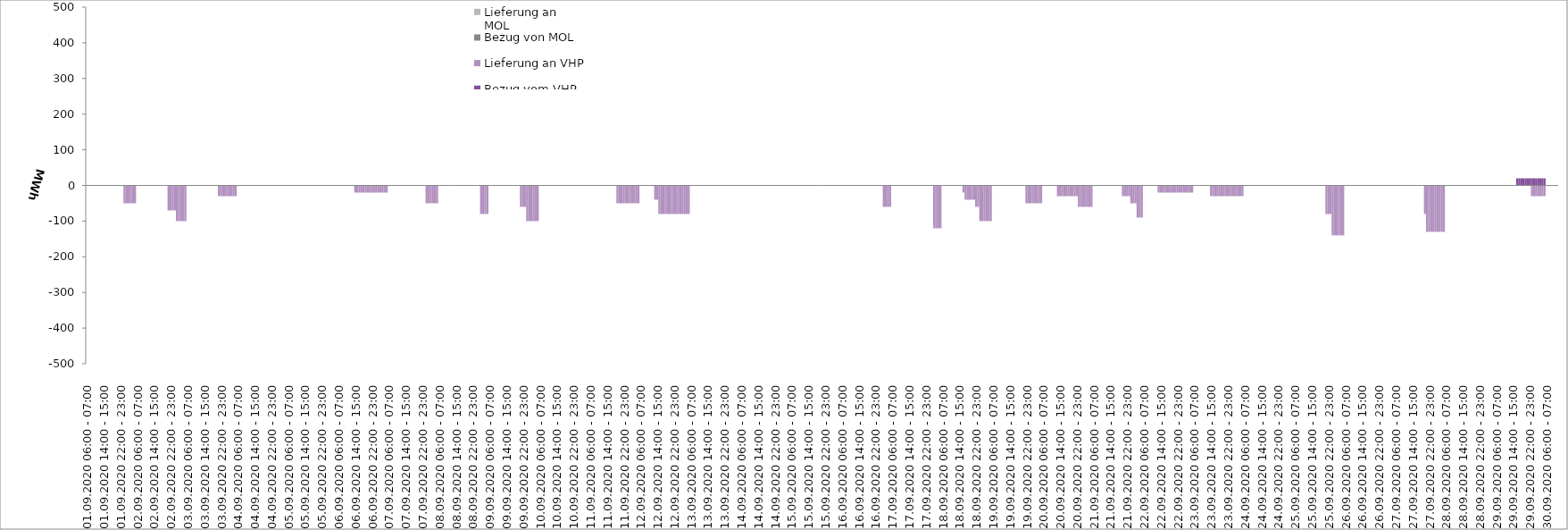
| Category | Bezug vom VHP | Lieferung an VHP | Bezug von MOL | Lieferung an MOL |
|---|---|---|---|---|
| 01.09.2020 06:00 - 07:00 | 0 | 0 | 0 | 0 |
| 01.09.2020 07:00 - 08:00 | 0 | 0 | 0 | 0 |
| 01.09.2020 08:00 - 09:00 | 0 | 0 | 0 | 0 |
| 01.09.2020 09:00 - 10:00 | 0 | 0 | 0 | 0 |
| 01.09.2020 10:00 - 11:00 | 0 | 0 | 0 | 0 |
| 01.09.2020 11:00 - 12:00 | 0 | 0 | 0 | 0 |
| 01.09.2020 12:00 - 13:00 | 0 | 0 | 0 | 0 |
| 01.09.2020 13:00 - 14:00 | 0 | 0 | 0 | 0 |
| 01.09.2020 14:00 - 15:00 | 0 | 0 | 0 | 0 |
| 01.09.2020 15:00 - 16:00 | 0 | 0 | 0 | 0 |
| 01.09.2020 16:00 - 17:00 | 0 | 0 | 0 | 0 |
| 01.09.2020 17:00 - 18:00 | 0 | 0 | 0 | 0 |
| 01.09.2020 18:00 - 19:00 | 0 | 0 | 0 | 0 |
| 01.09.2020 19:00 - 20:00 | 0 | 0 | 0 | 0 |
| 01.09.2020 20:00 - 21:00 | 0 | 0 | 0 | 0 |
| 01.09.2020 21:00 - 22:00 | 0 | 0 | 0 | 0 |
| 01.09.2020 22:00 - 23:00 | 0 | 0 | 0 | 0 |
| 01.09.2020 23:00 - 24:00 | 0 | 0 | 0 | 0 |
| 02.09.2020 00:00 - 01:00 | 0 | -50 | 0 | 0 |
| 02.09.2020 01:00 - 02:00 | 0 | -50 | 0 | 0 |
| 02.09.2020 02:00 - 03:00 | 0 | -50 | 0 | 0 |
| 02.09.2020 03:00 - 04:00 | 0 | -50 | 0 | 0 |
| 02.09.2020 04:00 - 05:00 | 0 | -50 | 0 | 0 |
| 02.09.2020 05:00 - 06:00 | 0 | -50 | 0 | 0 |
| 02.09.2020 06:00 - 07:00 | 0 | 0 | 0 | 0 |
| 02.09.2020 07:00 - 08:00 | 0 | 0 | 0 | 0 |
| 02.09.2020 08:00 - 09:00 | 0 | 0 | 0 | 0 |
| 02.09.2020 09:00 - 10:00 | 0 | 0 | 0 | 0 |
| 02.09.2020 10:00 - 11:00 | 0 | 0 | 0 | 0 |
| 02.09.2020 11:00 - 12:00 | 0 | 0 | 0 | 0 |
| 02.09.2020 12:00 - 13:00 | 0 | 0 | 0 | 0 |
| 02.09.2020 13:00 - 14:00 | 0 | 0 | 0 | 0 |
| 02.09.2020 14:00 - 15:00 | 0 | 0 | 0 | 0 |
| 02.09.2020 15:00 - 16:00 | 0 | 0 | 0 | 0 |
| 02.09.2020 16:00 - 17:00 | 0 | 0 | 0 | 0 |
| 02.09.2020 17:00 - 18:00 | 0 | 0 | 0 | 0 |
| 02.09.2020 18:00 - 19:00 | 0 | 0 | 0 | 0 |
| 02.09.2020 19:00 - 20:00 | 0 | 0 | 0 | 0 |
| 02.09.2020 20:00 - 21:00 | 0 | 0 | 0 | 0 |
| 02.09.2020 21:00 - 22:00 | 0 | -70 | 0 | 0 |
| 02.09.2020 22:00 - 23:00 | 0 | -70 | 0 | 0 |
| 02.09.2020 23:00 - 24:00 | 0 | -70 | 0 | 0 |
| 03.09.2020 00:00 - 01:00 | 0 | -70 | 0 | 0 |
| 03.09.2020 01:00 - 02:00 | 0 | -100 | 0 | 0 |
| 03.09.2020 02:00 - 03:00 | 0 | -100 | 0 | 0 |
| 03.09.2020 03:00 - 04:00 | 0 | -100 | 0 | 0 |
| 03.09.2020 04:00 - 05:00 | 0 | -100 | 0 | 0 |
| 03.09.2020 05:00 - 06:00 | 0 | -100 | 0 | 0 |
| 03.09.2020 06:00 - 07:00 | 0 | 0 | 0 | 0 |
| 03.09.2020 07:00 - 08:00 | 0 | 0 | 0 | 0 |
| 03.09.2020 08:00 - 09:00 | 0 | 0 | 0 | 0 |
| 03.09.2020 09:00 - 10:00 | 0 | 0 | 0 | 0 |
| 03.09.2020 10:00 - 11:00 | 0 | 0 | 0 | 0 |
| 03.09.2020 11:00 - 12:00 | 0 | 0 | 0 | 0 |
| 03.09.2020 12:00 - 13:00 | 0 | 0 | 0 | 0 |
| 03.09.2020 13:00 - 14:00 | 0 | 0 | 0 | 0 |
| 03.09.2020 14:00 - 15:00 | 0 | 0 | 0 | 0 |
| 03.09.2020 15:00 - 16:00 | 0 | 0 | 0 | 0 |
| 03.09.2020 16:00 - 17:00 | 0 | 0 | 0 | 0 |
| 03.09.2020 17:00 - 18:00 | 0 | 0 | 0 | 0 |
| 03.09.2020 18:00 - 19:00 | 0 | 0 | 0 | 0 |
| 03.09.2020 19:00 - 20:00 | 0 | 0 | 0 | 0 |
| 03.09.2020 20:00 - 21:00 | 0 | 0 | 0 | 0 |
| 03.09.2020 21:00 - 22:00 | 0 | -30 | 0 | 0 |
| 03.09.2020 22:00 - 23:00 | 0 | -30 | 0 | 0 |
| 03.09.2020 23:00 - 24:00 | 0 | -30 | 0 | 0 |
| 04.09.2020 00:00 - 01:00 | 0 | -30 | 0 | 0 |
| 04.09.2020 01:00 - 02:00 | 0 | -30 | 0 | 0 |
| 04.09.2020 02:00 - 03:00 | 0 | -30 | 0 | 0 |
| 04.09.2020 03:00 - 04:00 | 0 | -30 | 0 | 0 |
| 04.09.2020 04:00 - 05:00 | 0 | -30 | 0 | 0 |
| 04.09.2020 05:00 - 06:00 | 0 | -30 | 0 | 0 |
| 04.09.2020 06:00 - 07:00 | 0 | 0 | 0 | 0 |
| 04.09.2020 07:00 - 08:00 | 0 | 0 | 0 | 0 |
| 04.09.2020 08:00 - 09:00 | 0 | 0 | 0 | 0 |
| 04.09.2020 09:00 - 10:00 | 0 | 0 | 0 | 0 |
| 04.09.2020 10:00 - 11:00 | 0 | 0 | 0 | 0 |
| 04.09.2020 11:00 - 12:00 | 0 | 0 | 0 | 0 |
| 04.09.2020 12:00 - 13:00 | 0 | 0 | 0 | 0 |
| 04.09.2020 13:00 - 14:00 | 0 | 0 | 0 | 0 |
| 04.09.2020 14:00 - 15:00 | 0 | 0 | 0 | 0 |
| 04.09.2020 15:00 - 16:00 | 0 | 0 | 0 | 0 |
| 04.09.2020 16:00 - 17:00 | 0 | 0 | 0 | 0 |
| 04.09.2020 17:00 - 18:00 | 0 | 0 | 0 | 0 |
| 04.09.2020 18:00 - 19:00 | 0 | 0 | 0 | 0 |
| 04.09.2020 19:00 - 20:00 | 0 | 0 | 0 | 0 |
| 04.09.2020 20:00 - 21:00 | 0 | 0 | 0 | 0 |
| 04.09.2020 21:00 - 22:00 | 0 | 0 | 0 | 0 |
| 04.09.2020 22:00 - 23:00 | 0 | 0 | 0 | 0 |
| 04.09.2020 23:00 - 24:00 | 0 | 0 | 0 | 0 |
| 05.09.2020 00:00 - 01:00 | 0 | 0 | 0 | 0 |
| 05.09.2020 01:00 - 02:00 | 0 | 0 | 0 | 0 |
| 05.09.2020 02:00 - 03:00 | 0 | 0 | 0 | 0 |
| 05.09.2020 03:00 - 04:00 | 0 | 0 | 0 | 0 |
| 05.09.2020 04:00 - 05:00 | 0 | 0 | 0 | 0 |
| 05.09.2020 05:00 - 06:00 | 0 | 0 | 0 | 0 |
| 05.09.2020 06:00 - 07:00 | 0 | 0 | 0 | 0 |
| 05.09.2020 07:00 - 08:00 | 0 | 0 | 0 | 0 |
| 05.09.2020 08:00 - 09:00 | 0 | 0 | 0 | 0 |
| 05.09.2020 09:00 - 10:00 | 0 | 0 | 0 | 0 |
| 05.09.2020 10:00 - 11:00 | 0 | 0 | 0 | 0 |
| 05.09.2020 11:00 - 12:00 | 0 | 0 | 0 | 0 |
| 05.09.2020 12:00 - 13:00 | 0 | 0 | 0 | 0 |
| 05.09.2020 13:00 - 14:00 | 0 | 0 | 0 | 0 |
| 05.09.2020 14:00 - 15:00 | 0 | 0 | 0 | 0 |
| 05.09.2020 15:00 - 16:00 | 0 | 0 | 0 | 0 |
| 05.09.2020 16:00 - 17:00 | 0 | 0 | 0 | 0 |
| 05.09.2020 17:00 - 18:00 | 0 | 0 | 0 | 0 |
| 05.09.2020 18:00 - 19:00 | 0 | 0 | 0 | 0 |
| 05.09.2020 19:00 - 20:00 | 0 | 0 | 0 | 0 |
| 05.09.2020 20:00 - 21:00 | 0 | 0 | 0 | 0 |
| 05.09.2020 21:00 - 22:00 | 0 | 0 | 0 | 0 |
| 05.09.2020 22:00 - 23:00 | 0 | 0 | 0 | 0 |
| 05.09.2020 23:00 - 24:00 | 0 | 0 | 0 | 0 |
| 06.09.2020 00:00 - 01:00 | 0 | 0 | 0 | 0 |
| 06.09.2020 01:00 - 02:00 | 0 | 0 | 0 | 0 |
| 06.09.2020 02:00 - 03:00 | 0 | 0 | 0 | 0 |
| 06.09.2020 03:00 - 04:00 | 0 | 0 | 0 | 0 |
| 06.09.2020 04:00 - 05:00 | 0 | 0 | 0 | 0 |
| 06.09.2020 05:00 - 06:00 | 0 | 0 | 0 | 0 |
| 06.09.2020 06:00 - 07:00 | 0 | 0 | 0 | 0 |
| 06.09.2020 07:00 - 08:00 | 0 | 0 | 0 | 0 |
| 06.09.2020 08:00 - 09:00 | 0 | 0 | 0 | 0 |
| 06.09.2020 09:00 - 10:00 | 0 | 0 | 0 | 0 |
| 06.09.2020 10:00 - 11:00 | 0 | 0 | 0 | 0 |
| 06.09.2020 11:00 - 12:00 | 0 | 0 | 0 | 0 |
| 06.09.2020 12:00 - 13:00 | 0 | 0 | 0 | 0 |
| 06.09.2020 13:00 - 14:00 | 0 | 0 | 0 | 0 |
| 06.09.2020 14:00 - 15:00 | 0 | -20 | 0 | 0 |
| 06.09.2020 15:00 - 16:00 | 0 | -20 | 0 | 0 |
| 06.09.2020 16:00 - 17:00 | 0 | -20 | 0 | 0 |
| 06.09.2020 17:00 - 18:00 | 0 | -20 | 0 | 0 |
| 06.09.2020 18:00 - 19:00 | 0 | -20 | 0 | 0 |
| 06.09.2020 19:00 - 20:00 | 0 | -20 | 0 | 0 |
| 06.09.2020 20:00 - 21:00 | 0 | -20 | 0 | 0 |
| 06.09.2020 21:00 - 22:00 | 0 | -20 | 0 | 0 |
| 06.09.2020 22:00 - 23:00 | 0 | -20 | 0 | 0 |
| 06.09.2020 23:00 - 24:00 | 0 | -20 | 0 | 0 |
| 07.09.2020 00:00 - 01:00 | 0 | -20 | 0 | 0 |
| 07.09.2020 01:00 - 02:00 | 0 | -20 | 0 | 0 |
| 07.09.2020 02:00 - 03:00 | 0 | -20 | 0 | 0 |
| 07.09.2020 03:00 - 04:00 | 0 | -20 | 0 | 0 |
| 07.09.2020 04:00 - 05:00 | 0 | -20 | 0 | 0 |
| 07.09.2020 05:00 - 06:00 | 0 | -20 | 0 | 0 |
| 07.09.2020 06:00 - 07:00 | 0 | 0 | 0 | 0 |
| 07.09.2020 07:00 - 08:00 | 0 | 0 | 0 | 0 |
| 07.09.2020 08:00 - 09:00 | 0 | 0 | 0 | 0 |
| 07.09.2020 09:00 - 10:00 | 0 | 0 | 0 | 0 |
| 07.09.2020 10:00 - 11:00 | 0 | 0 | 0 | 0 |
| 07.09.2020 11:00 - 12:00 | 0 | 0 | 0 | 0 |
| 07.09.2020 12:00 - 13:00 | 0 | 0 | 0 | 0 |
| 07.09.2020 13:00 - 14:00 | 0 | 0 | 0 | 0 |
| 07.09.2020 14:00 - 15:00 | 0 | 0 | 0 | 0 |
| 07.09.2020 15:00 - 16:00 | 0 | 0 | 0 | 0 |
| 07.09.2020 16:00 - 17:00 | 0 | 0 | 0 | 0 |
| 07.09.2020 17:00 - 18:00 | 0 | 0 | 0 | 0 |
| 07.09.2020 18:00 - 19:00 | 0 | 0 | 0 | 0 |
| 07.09.2020 19:00 - 20:00 | 0 | 0 | 0 | 0 |
| 07.09.2020 20:00 - 21:00 | 0 | 0 | 0 | 0 |
| 07.09.2020 21:00 - 22:00 | 0 | 0 | 0 | 0 |
| 07.09.2020 22:00 - 23:00 | 0 | 0 | 0 | 0 |
| 07.09.2020 23:00 - 24:00 | 0 | 0 | 0 | 0 |
| 08.09.2020 00:00 - 01:00 | 0 | -50 | 0 | 0 |
| 08.09.2020 01:00 - 02:00 | 0 | -50 | 0 | 0 |
| 08.09.2020 02:00 - 03:00 | 0 | -50 | 0 | 0 |
| 08.09.2020 03:00 - 04:00 | 0 | -50 | 0 | 0 |
| 08.09.2020 04:00 - 05:00 | 0 | -50 | 0 | 0 |
| 08.09.2020 05:00 - 06:00 | 0 | -50 | 0 | 0 |
| 08.09.2020 06:00 - 07:00 | 0 | 0 | 0 | 0 |
| 08.09.2020 07:00 - 08:00 | 0 | 0 | 0 | 0 |
| 08.09.2020 08:00 - 09:00 | 0 | 0 | 0 | 0 |
| 08.09.2020 09:00 - 10:00 | 0 | 0 | 0 | 0 |
| 08.09.2020 10:00 - 11:00 | 0 | 0 | 0 | 0 |
| 08.09.2020 11:00 - 12:00 | 0 | 0 | 0 | 0 |
| 08.09.2020 12:00 - 13:00 | 0 | 0 | 0 | 0 |
| 08.09.2020 13:00 - 14:00 | 0 | 0 | 0 | 0 |
| 08.09.2020 14:00 - 15:00 | 0 | 0 | 0 | 0 |
| 08.09.2020 15:00 - 16:00 | 0 | 0 | 0 | 0 |
| 08.09.2020 16:00 - 17:00 | 0 | 0 | 0 | 0 |
| 08.09.2020 17:00 - 18:00 | 0 | 0 | 0 | 0 |
| 08.09.2020 18:00 - 19:00 | 0 | 0 | 0 | 0 |
| 08.09.2020 19:00 - 20:00 | 0 | 0 | 0 | 0 |
| 08.09.2020 20:00 - 21:00 | 0 | 0 | 0 | 0 |
| 08.09.2020 21:00 - 22:00 | 0 | 0 | 0 | 0 |
| 08.09.2020 22:00 - 23:00 | 0 | 0 | 0 | 0 |
| 08.09.2020 23:00 - 24:00 | 0 | 0 | 0 | 0 |
| 09.09.2020 00:00 - 01:00 | 0 | 0 | 0 | 0 |
| 09.09.2020 01:00 - 02:00 | 0 | 0 | 0 | 0 |
| 09.09.2020 02:00 - 03:00 | 0 | -80 | 0 | 0 |
| 09.09.2020 03:00 - 04:00 | 0 | -80 | 0 | 0 |
| 09.09.2020 04:00 - 05:00 | 0 | -80 | 0 | 0 |
| 09.09.2020 05:00 - 06:00 | 0 | -80 | 0 | 0 |
| 09.09.2020 06:00 - 07:00 | 0 | 0 | 0 | 0 |
| 09.09.2020 07:00 - 08:00 | 0 | 0 | 0 | 0 |
| 09.09.2020 08:00 - 09:00 | 0 | 0 | 0 | 0 |
| 09.09.2020 09:00 - 10:00 | 0 | 0 | 0 | 0 |
| 09.09.2020 10:00 - 11:00 | 0 | 0 | 0 | 0 |
| 09.09.2020 11:00 - 12:00 | 0 | 0 | 0 | 0 |
| 09.09.2020 12:00 - 13:00 | 0 | 0 | 0 | 0 |
| 09.09.2020 13:00 - 14:00 | 0 | 0 | 0 | 0 |
| 09.09.2020 14:00 - 15:00 | 0 | 0 | 0 | 0 |
| 09.09.2020 15:00 - 16:00 | 0 | 0 | 0 | 0 |
| 09.09.2020 16:00 - 17:00 | 0 | 0 | 0 | 0 |
| 09.09.2020 17:00 - 18:00 | 0 | 0 | 0 | 0 |
| 09.09.2020 18:00 - 19:00 | 0 | 0 | 0 | 0 |
| 09.09.2020 19:00 - 20:00 | 0 | 0 | 0 | 0 |
| 09.09.2020 20:00 - 21:00 | 0 | 0 | 0 | 0 |
| 09.09.2020 21:00 - 22:00 | 0 | -60 | 0 | 0 |
| 09.09.2020 22:00 - 23:00 | 0 | -60 | 0 | 0 |
| 09.09.2020 23:00 - 24:00 | 0 | -60 | 0 | 0 |
| 10.09.2020 00:00 - 01:00 | 0 | -100 | 0 | 0 |
| 10.09.2020 01:00 - 02:00 | 0 | -100 | 0 | 0 |
| 10.09.2020 02:00 - 03:00 | 0 | -100 | 0 | 0 |
| 10.09.2020 03:00 - 04:00 | 0 | -100 | 0 | 0 |
| 10.09.2020 04:00 - 05:00 | 0 | -100 | 0 | 0 |
| 10.09.2020 05:00 - 06:00 | 0 | -100 | 0 | 0 |
| 10.09.2020 06:00 - 07:00 | 0 | 0 | 0 | 0 |
| 10.09.2020 07:00 - 08:00 | 0 | 0 | 0 | 0 |
| 10.09.2020 08:00 - 09:00 | 0 | 0 | 0 | 0 |
| 10.09.2020 09:00 - 10:00 | 0 | 0 | 0 | 0 |
| 10.09.2020 10:00 - 11:00 | 0 | 0 | 0 | 0 |
| 10.09.2020 11:00 - 12:00 | 0 | 0 | 0 | 0 |
| 10.09.2020 12:00 - 13:00 | 0 | 0 | 0 | 0 |
| 10.09.2020 13:00 - 14:00 | 0 | 0 | 0 | 0 |
| 10.09.2020 14:00 - 15:00 | 0 | 0 | 0 | 0 |
| 10.09.2020 15:00 - 16:00 | 0 | 0 | 0 | 0 |
| 10.09.2020 16:00 - 17:00 | 0 | 0 | 0 | 0 |
| 10.09.2020 17:00 - 18:00 | 0 | 0 | 0 | 0 |
| 10.09.2020 18:00 - 19:00 | 0 | 0 | 0 | 0 |
| 10.09.2020 19:00 - 20:00 | 0 | 0 | 0 | 0 |
| 10.09.2020 20:00 - 21:00 | 0 | 0 | 0 | 0 |
| 10.09.2020 21:00 - 22:00 | 0 | 0 | 0 | 0 |
| 10.09.2020 22:00 - 23:00 | 0 | 0 | 0 | 0 |
| 10.09.2020 23:00 - 24:00 | 0 | 0 | 0 | 0 |
| 11.09.2020 00:00 - 01:00 | 0 | 0 | 0 | 0 |
| 11.09.2020 01:00 - 02:00 | 0 | 0 | 0 | 0 |
| 11.09.2020 02:00 - 03:00 | 0 | 0 | 0 | 0 |
| 11.09.2020 03:00 - 04:00 | 0 | 0 | 0 | 0 |
| 11.09.2020 04:00 - 05:00 | 0 | 0 | 0 | 0 |
| 11.09.2020 05:00 - 06:00 | 0 | 0 | 0 | 0 |
| 11.09.2020 06:00 - 07:00 | 0 | 0 | 0 | 0 |
| 11.09.2020 07:00 - 08:00 | 0 | 0 | 0 | 0 |
| 11.09.2020 08:00 - 09:00 | 0 | 0 | 0 | 0 |
| 11.09.2020 09:00 - 10:00 | 0 | 0 | 0 | 0 |
| 11.09.2020 10:00 - 11:00 | 0 | 0 | 0 | 0 |
| 11.09.2020 11:00 - 12:00 | 0 | 0 | 0 | 0 |
| 11.09.2020 12:00 - 13:00 | 0 | 0 | 0 | 0 |
| 11.09.2020 13:00 - 14:00 | 0 | 0 | 0 | 0 |
| 11.09.2020 14:00 - 15:00 | 0 | 0 | 0 | 0 |
| 11.09.2020 15:00 - 16:00 | 0 | 0 | 0 | 0 |
| 11.09.2020 16:00 - 17:00 | 0 | 0 | 0 | 0 |
| 11.09.2020 17:00 - 18:00 | 0 | 0 | 0 | 0 |
| 11.09.2020 18:00 - 19:00 | 0 | 0 | 0 | 0 |
| 11.09.2020 19:00 - 20:00 | 0 | -50 | 0 | 0 |
| 11.09.2020 20:00 - 21:00 | 0 | -50 | 0 | 0 |
| 11.09.2020 21:00 - 22:00 | 0 | -50 | 0 | 0 |
| 11.09.2020 22:00 - 23:00 | 0 | -50 | 0 | 0 |
| 11.09.2020 23:00 - 24:00 | 0 | -50 | 0 | 0 |
| 12.09.2020 00:00 - 01:00 | 0 | -50 | 0 | 0 |
| 12.09.2020 01:00 - 02:00 | 0 | -50 | 0 | 0 |
| 12.09.2020 02:00 - 03:00 | 0 | -50 | 0 | 0 |
| 12.09.2020 03:00 - 04:00 | 0 | -50 | 0 | 0 |
| 12.09.2020 04:00 - 05:00 | 0 | -50 | 0 | 0 |
| 12.09.2020 05:00 - 06:00 | 0 | -50 | 0 | 0 |
| 12.09.2020 06:00 - 07:00 | 0 | 0 | 0 | 0 |
| 12.09.2020 07:00 - 08:00 | 0 | 0 | 0 | 0 |
| 12.09.2020 08:00 - 09:00 | 0 | 0 | 0 | 0 |
| 12.09.2020 09:00 - 10:00 | 0 | 0 | 0 | 0 |
| 12.09.2020 10:00 - 11:00 | 0 | 0 | 0 | 0 |
| 12.09.2020 11:00 - 12:00 | 0 | 0 | 0 | 0 |
| 12.09.2020 12:00 - 13:00 | 0 | 0 | 0 | 0 |
| 12.09.2020 13:00 - 14:00 | 0 | -40 | 0 | 0 |
| 12.09.2020 14:00 - 15:00 | 0 | -40 | 0 | 0 |
| 12.09.2020 15:00 - 16:00 | 0 | -80 | 0 | 0 |
| 12.09.2020 16:00 - 17:00 | 0 | -80 | 0 | 0 |
| 12.09.2020 17:00 - 18:00 | 0 | -80 | 0 | 0 |
| 12.09.2020 18:00 - 19:00 | 0 | -80 | 0 | 0 |
| 12.09.2020 19:00 - 20:00 | 0 | -80 | 0 | 0 |
| 12.09.2020 20:00 - 21:00 | 0 | -80 | 0 | 0 |
| 12.09.2020 21:00 - 22:00 | 0 | -80 | 0 | 0 |
| 12.09.2020 22:00 - 23:00 | 0 | -80 | 0 | 0 |
| 12.09.2020 23:00 - 24:00 | 0 | -80 | 0 | 0 |
| 13.09.2020 00:00 - 01:00 | 0 | -80 | 0 | 0 |
| 13.09.2020 01:00 - 02:00 | 0 | -80 | 0 | 0 |
| 13.09.2020 02:00 - 03:00 | 0 | -80 | 0 | 0 |
| 13.09.2020 03:00 - 04:00 | 0 | -80 | 0 | 0 |
| 13.09.2020 04:00 - 05:00 | 0 | -80 | 0 | 0 |
| 13.09.2020 05:00 - 06:00 | 0 | -80 | 0 | 0 |
| 13.09.2020 06:00 - 07:00 | 0 | 0 | 0 | 0 |
| 13.09.2020 07:00 - 08:00 | 0 | 0 | 0 | 0 |
| 13.09.2020 08:00 - 09:00 | 0 | 0 | 0 | 0 |
| 13.09.2020 09:00 - 10:00 | 0 | 0 | 0 | 0 |
| 13.09.2020 10:00 - 11:00 | 0 | 0 | 0 | 0 |
| 13.09.2020 11:00 - 12:00 | 0 | 0 | 0 | 0 |
| 13.09.2020 12:00 - 13:00 | 0 | 0 | 0 | 0 |
| 13.09.2020 13:00 - 14:00 | 0 | 0 | 0 | 0 |
| 13.09.2020 14:00 - 15:00 | 0 | 0 | 0 | 0 |
| 13.09.2020 15:00 - 16:00 | 0 | 0 | 0 | 0 |
| 13.09.2020 16:00 - 17:00 | 0 | 0 | 0 | 0 |
| 13.09.2020 17:00 - 18:00 | 0 | 0 | 0 | 0 |
| 13.09.2020 18:00 - 19:00 | 0 | 0 | 0 | 0 |
| 13.09.2020 19:00 - 20:00 | 0 | 0 | 0 | 0 |
| 13.09.2020 20:00 - 21:00 | 0 | 0 | 0 | 0 |
| 13.09.2020 21:00 - 22:00 | 0 | 0 | 0 | 0 |
| 13.09.2020 22:00 - 23:00 | 0 | 0 | 0 | 0 |
| 13.09.2020 23:00 - 24:00 | 0 | 0 | 0 | 0 |
| 14.09.2020 00:00 - 01:00 | 0 | 0 | 0 | 0 |
| 14.09.2020 01:00 - 02:00 | 0 | 0 | 0 | 0 |
| 14.09.2020 02:00 - 03:00 | 0 | 0 | 0 | 0 |
| 14.09.2020 03:00 - 04:00 | 0 | 0 | 0 | 0 |
| 14.09.2020 04:00 - 05:00 | 0 | 0 | 0 | 0 |
| 14.09.2020 05:00 - 06:00 | 0 | 0 | 0 | 0 |
| 14.09.2020 06:00 - 07:00 | 0 | 0 | 0 | 0 |
| 14.09.2020 07:00 - 08:00 | 0 | 0 | 0 | 0 |
| 14.09.2020 08:00 - 09:00 | 0 | 0 | 0 | 0 |
| 14.09.2020 09:00 - 10:00 | 0 | 0 | 0 | 0 |
| 14.09.2020 10:00 - 11:00 | 0 | 0 | 0 | 0 |
| 14.09.2020 11:00 - 12:00 | 0 | 0 | 0 | 0 |
| 14.09.2020 12:00 - 13:00 | 0 | 0 | 0 | 0 |
| 14.09.2020 13:00 - 14:00 | 0 | 0 | 0 | 0 |
| 14.09.2020 14:00 - 15:00 | 0 | 0 | 0 | 0 |
| 14.09.2020 15:00 - 16:00 | 0 | 0 | 0 | 0 |
| 14.09.2020 16:00 - 17:00 | 0 | 0 | 0 | 0 |
| 14.09.2020 17:00 - 18:00 | 0 | 0 | 0 | 0 |
| 14.09.2020 18:00 - 19:00 | 0 | 0 | 0 | 0 |
| 14.09.2020 19:00 - 20:00 | 0 | 0 | 0 | 0 |
| 14.09.2020 20:00 - 21:00 | 0 | 0 | 0 | 0 |
| 14.09.2020 21:00 - 22:00 | 0 | 0 | 0 | 0 |
| 14.09.2020 22:00 - 23:00 | 0 | 0 | 0 | 0 |
| 14.09.2020 23:00 - 24:00 | 0 | 0 | 0 | 0 |
| 15.09.2020 00:00 - 01:00 | 0 | 0 | 0 | 0 |
| 15.09.2020 01:00 - 02:00 | 0 | 0 | 0 | 0 |
| 15.09.2020 02:00 - 03:00 | 0 | 0 | 0 | 0 |
| 15.09.2020 03:00 - 04:00 | 0 | 0 | 0 | 0 |
| 15.09.2020 04:00 - 05:00 | 0 | 0 | 0 | 0 |
| 15.09.2020 05:00 - 06:00 | 0 | 0 | 0 | 0 |
| 15.09.2020 06:00 - 07:00 | 0 | 0 | 0 | 0 |
| 15.09.2020 07:00 - 08:00 | 0 | 0 | 0 | 0 |
| 15.09.2020 08:00 - 09:00 | 0 | 0 | 0 | 0 |
| 15.09.2020 09:00 - 10:00 | 0 | 0 | 0 | 0 |
| 15.09.2020 10:00 - 11:00 | 0 | 0 | 0 | 0 |
| 15.09.2020 11:00 - 12:00 | 0 | 0 | 0 | 0 |
| 15.09.2020 12:00 - 13:00 | 0 | 0 | 0 | 0 |
| 15.09.2020 13:00 - 14:00 | 0 | 0 | 0 | 0 |
| 15.09.2020 14:00 - 15:00 | 0 | 0 | 0 | 0 |
| 15.09.2020 15:00 - 16:00 | 0 | 0 | 0 | 0 |
| 15.09.2020 16:00 - 17:00 | 0 | 0 | 0 | 0 |
| 15.09.2020 17:00 - 18:00 | 0 | 0 | 0 | 0 |
| 15.09.2020 18:00 - 19:00 | 0 | 0 | 0 | 0 |
| 15.09.2020 19:00 - 20:00 | 0 | 0 | 0 | 0 |
| 15.09.2020 20:00 - 21:00 | 0 | 0 | 0 | 0 |
| 15.09.2020 21:00 - 22:00 | 0 | 0 | 0 | 0 |
| 15.09.2020 22:00 - 23:00 | 0 | 0 | 0 | 0 |
| 15.09.2020 23:00 - 24:00 | 0 | 0 | 0 | 0 |
| 16.09.2020 00:00 - 01:00 | 0 | 0 | 0 | 0 |
| 16.09.2020 01:00 - 02:00 | 0 | 0 | 0 | 0 |
| 16.09.2020 02:00 - 03:00 | 0 | 0 | 0 | 0 |
| 16.09.2020 03:00 - 04:00 | 0 | 0 | 0 | 0 |
| 16.09.2020 04:00 - 05:00 | 0 | 0 | 0 | 0 |
| 16.09.2020 05:00 - 06:00 | 0 | 0 | 0 | 0 |
| 16.09.2020 06:00 - 07:00 | 0 | 0 | 0 | 0 |
| 16.09.2020 07:00 - 08:00 | 0 | 0 | 0 | 0 |
| 16.09.2020 08:00 - 09:00 | 0 | 0 | 0 | 0 |
| 16.09.2020 09:00 - 10:00 | 0 | 0 | 0 | 0 |
| 16.09.2020 10:00 - 11:00 | 0 | 0 | 0 | 0 |
| 16.09.2020 11:00 - 12:00 | 0 | 0 | 0 | 0 |
| 16.09.2020 12:00 - 13:00 | 0 | 0 | 0 | 0 |
| 16.09.2020 13:00 - 14:00 | 0 | 0 | 0 | 0 |
| 16.09.2020 14:00 - 15:00 | 0 | 0 | 0 | 0 |
| 16.09.2020 15:00 - 16:00 | 0 | 0 | 0 | 0 |
| 16.09.2020 16:00 - 17:00 | 0 | 0 | 0 | 0 |
| 16.09.2020 17:00 - 18:00 | 0 | 0 | 0 | 0 |
| 16.09.2020 18:00 - 19:00 | 0 | 0 | 0 | 0 |
| 16.09.2020 19:00 - 20:00 | 0 | 0 | 0 | 0 |
| 16.09.2020 20:00 - 21:00 | 0 | 0 | 0 | 0 |
| 16.09.2020 21:00 - 22:00 | 0 | 0 | 0 | 0 |
| 16.09.2020 22:00 - 23:00 | 0 | 0 | 0 | 0 |
| 16.09.2020 23:00 - 24:00 | 0 | 0 | 0 | 0 |
| 17.09.2020 00:00 - 01:00 | 0 | 0 | 0 | 0 |
| 17.09.2020 01:00 - 02:00 | 0 | 0 | 0 | 0 |
| 17.09.2020 02:00 - 03:00 | 0 | -60 | 0 | 0 |
| 17.09.2020 03:00 - 04:00 | 0 | -60 | 0 | 0 |
| 17.09.2020 04:00 - 05:00 | 0 | -60 | 0 | 0 |
| 17.09.2020 05:00 - 06:00 | 0 | -60 | 0 | 0 |
| 17.09.2020 06:00 - 07:00 | 0 | 0 | 0 | 0 |
| 17.09.2020 07:00 - 08:00 | 0 | 0 | 0 | 0 |
| 17.09.2020 08:00 - 09:00 | 0 | 0 | 0 | 0 |
| 17.09.2020 09:00 - 10:00 | 0 | 0 | 0 | 0 |
| 17.09.2020 10:00 - 11:00 | 0 | 0 | 0 | 0 |
| 17.09.2020 11:00 - 12:00 | 0 | 0 | 0 | 0 |
| 17.09.2020 12:00 - 13:00 | 0 | 0 | 0 | 0 |
| 17.09.2020 13:00 - 14:00 | 0 | 0 | 0 | 0 |
| 17.09.2020 14:00 - 15:00 | 0 | 0 | 0 | 0 |
| 17.09.2020 15:00 - 16:00 | 0 | 0 | 0 | 0 |
| 17.09.2020 16:00 - 17:00 | 0 | 0 | 0 | 0 |
| 17.09.2020 17:00 - 18:00 | 0 | 0 | 0 | 0 |
| 17.09.2020 18:00 - 19:00 | 0 | 0 | 0 | 0 |
| 17.09.2020 19:00 - 20:00 | 0 | 0 | 0 | 0 |
| 17.09.2020 20:00 - 21:00 | 0 | 0 | 0 | 0 |
| 17.09.2020 21:00 - 22:00 | 0 | 0 | 0 | 0 |
| 17.09.2020 22:00 - 23:00 | 0 | 0 | 0 | 0 |
| 17.09.2020 23:00 - 24:00 | 0 | 0 | 0 | 0 |
| 18.09.2020 00:00 - 01:00 | 0 | 0 | 0 | 0 |
| 18.09.2020 01:00 - 02:00 | 0 | 0 | 0 | 0 |
| 18.09.2020 02:00 - 03:00 | 0 | -120 | 0 | 0 |
| 18.09.2020 03:00 - 04:00 | 0 | -120 | 0 | 0 |
| 18.09.2020 04:00 - 05:00 | 0 | -120 | 0 | 0 |
| 18.09.2020 05:00 - 06:00 | 0 | -120 | 0 | 0 |
| 18.09.2020 06:00 - 07:00 | 0 | 0 | 0 | 0 |
| 18.09.2020 07:00 - 08:00 | 0 | 0 | 0 | 0 |
| 18.09.2020 08:00 - 09:00 | 0 | 0 | 0 | 0 |
| 18.09.2020 09:00 - 10:00 | 0 | 0 | 0 | 0 |
| 18.09.2020 10:00 - 11:00 | 0 | 0 | 0 | 0 |
| 18.09.2020 11:00 - 12:00 | 0 | 0 | 0 | 0 |
| 18.09.2020 12:00 - 13:00 | 0 | 0 | 0 | 0 |
| 18.09.2020 13:00 - 14:00 | 0 | 0 | 0 | 0 |
| 18.09.2020 14:00 - 15:00 | 0 | 0 | 0 | 0 |
| 18.09.2020 15:00 - 16:00 | 0 | 0 | 0 | 0 |
| 18.09.2020 16:00 - 17:00 | 0 | -20 | 0 | 0 |
| 18.09.2020 17:00 - 18:00 | 0 | -40 | 0 | 0 |
| 18.09.2020 18:00 - 19:00 | 0 | -40 | 0 | 0 |
| 18.09.2020 19:00 - 20:00 | 0 | -40 | 0 | 0 |
| 18.09.2020 20:00 - 21:00 | 0 | -40 | 0 | 0 |
| 18.09.2020 21:00 - 22:00 | 0 | -40 | 0 | 0 |
| 18.09.2020 22:00 - 23:00 | 0 | -60 | 0 | 0 |
| 18.09.2020 23:00 - 24:00 | 0 | -60 | 0 | 0 |
| 19.09.2020 00:00 - 01:00 | 0 | -100 | 0 | 0 |
| 19.09.2020 01:00 - 02:00 | 0 | -100 | 0 | 0 |
| 19.09.2020 02:00 - 03:00 | 0 | -100 | 0 | 0 |
| 19.09.2020 03:00 - 04:00 | 0 | -100 | 0 | 0 |
| 19.09.2020 04:00 - 05:00 | 0 | -100 | 0 | 0 |
| 19.09.2020 05:00 - 06:00 | 0 | -100 | 0 | 0 |
| 19.09.2020 06:00 - 07:00 | 0 | 0 | 0 | 0 |
| 19.09.2020 07:00 - 08:00 | 0 | 0 | 0 | 0 |
| 19.09.2020 08:00 - 09:00 | 0 | 0 | 0 | 0 |
| 19.09.2020 09:00 - 10:00 | 0 | 0 | 0 | 0 |
| 19.09.2020 10:00 - 11:00 | 0 | 0 | 0 | 0 |
| 19.09.2020 11:00 - 12:00 | 0 | 0 | 0 | 0 |
| 19.09.2020 12:00 - 13:00 | 0 | 0 | 0 | 0 |
| 19.09.2020 13:00 - 14:00 | 0 | 0 | 0 | 0 |
| 19.09.2020 14:00 - 15:00 | 0 | 0 | 0 | 0 |
| 19.09.2020 15:00 - 16:00 | 0 | 0 | 0 | 0 |
| 19.09.2020 16:00 - 17:00 | 0 | 0 | 0 | 0 |
| 19.09.2020 17:00 - 18:00 | 0 | 0 | 0 | 0 |
| 19.09.2020 18:00 - 19:00 | 0 | 0 | 0 | 0 |
| 19.09.2020 19:00 - 20:00 | 0 | 0 | 0 | 0 |
| 19.09.2020 20:00 - 21:00 | 0 | 0 | 0 | 0 |
| 19.09.2020 21:00 - 22:00 | 0 | 0 | 0 | 0 |
| 19.09.2020 22:00 - 23:00 | 0 | -50 | 0 | 0 |
| 19.09.2020 23:00 - 24:00 | 0 | -50 | 0 | 0 |
| 20.09.2020 00:00 - 01:00 | 0 | -50 | 0 | 0 |
| 20.09.2020 01:00 - 02:00 | 0 | -50 | 0 | 0 |
| 20.09.2020 02:00 - 03:00 | 0 | -50 | 0 | 0 |
| 20.09.2020 03:00 - 04:00 | 0 | -50 | 0 | 0 |
| 20.09.2020 04:00 - 05:00 | 0 | -50 | 0 | 0 |
| 20.09.2020 05:00 - 06:00 | 0 | -50 | 0 | 0 |
| 20.09.2020 06:00 - 07:00 | 0 | 0 | 0 | 0 |
| 20.09.2020 07:00 - 08:00 | 0 | 0 | 0 | 0 |
| 20.09.2020 08:00 - 09:00 | 0 | 0 | 0 | 0 |
| 20.09.2020 09:00 - 10:00 | 0 | 0 | 0 | 0 |
| 20.09.2020 10:00 - 11:00 | 0 | 0 | 0 | 0 |
| 20.09.2020 11:00 - 12:00 | 0 | 0 | 0 | 0 |
| 20.09.2020 12:00 - 13:00 | 0 | 0 | 0 | 0 |
| 20.09.2020 13:00 - 14:00 | 0 | -30 | 0 | 0 |
| 20.09.2020 14:00 - 15:00 | 0 | -30 | 0 | 0 |
| 20.09.2020 15:00 - 16:00 | 0 | -30 | 0 | 0 |
| 20.09.2020 16:00 - 17:00 | 0 | -30 | 0 | 0 |
| 20.09.2020 17:00 - 18:00 | 0 | -30 | 0 | 0 |
| 20.09.2020 18:00 - 19:00 | 0 | -30 | 0 | 0 |
| 20.09.2020 19:00 - 20:00 | 0 | -30 | 0 | 0 |
| 20.09.2020 20:00 - 21:00 | 0 | -30 | 0 | 0 |
| 20.09.2020 21:00 - 22:00 | 0 | -30 | 0 | 0 |
| 20.09.2020 22:00 - 23:00 | 0 | -30 | 0 | 0 |
| 20.09.2020 23:00 - 24:00 | 0 | -60 | 0 | 0 |
| 21.09.2020 00:00 - 01:00 | 0 | -60 | 0 | 0 |
| 21.09.2020 01:00 - 02:00 | 0 | -60 | 0 | 0 |
| 21.09.2020 02:00 - 03:00 | 0 | -60 | 0 | 0 |
| 21.09.2020 03:00 - 04:00 | 0 | -60 | 0 | 0 |
| 21.09.2020 04:00 - 05:00 | 0 | -60 | 0 | 0 |
| 21.09.2020 05:00 - 06:00 | 0 | -60 | 0 | 0 |
| 21.09.2020 06:00 - 07:00 | 0 | 0 | 0 | 0 |
| 21.09.2020 07:00 - 08:00 | 0 | 0 | 0 | 0 |
| 21.09.2020 08:00 - 09:00 | 0 | 0 | 0 | 0 |
| 21.09.2020 09:00 - 10:00 | 0 | 0 | 0 | 0 |
| 21.09.2020 10:00 - 11:00 | 0 | 0 | 0 | 0 |
| 21.09.2020 11:00 - 12:00 | 0 | 0 | 0 | 0 |
| 21.09.2020 12:00 - 13:00 | 0 | 0 | 0 | 0 |
| 21.09.2020 13:00 - 14:00 | 0 | 0 | 0 | 0 |
| 21.09.2020 14:00 - 15:00 | 0 | 0 | 0 | 0 |
| 21.09.2020 15:00 - 16:00 | 0 | 0 | 0 | 0 |
| 21.09.2020 16:00 - 17:00 | 0 | 0 | 0 | 0 |
| 21.09.2020 17:00 - 18:00 | 0 | 0 | 0 | 0 |
| 21.09.2020 18:00 - 19:00 | 0 | 0 | 0 | 0 |
| 21.09.2020 19:00 - 20:00 | 0 | 0 | 0 | 0 |
| 21.09.2020 20:00 - 21:00 | 0 | -30 | 0 | 0 |
| 21.09.2020 21:00 - 22:00 | 0 | -30 | 0 | 0 |
| 21.09.2020 22:00 - 23:00 | 0 | -30 | 0 | 0 |
| 21.09.2020 23:00 - 24:00 | 0 | -30 | 0 | 0 |
| 22.09.2020 00:00 - 01:00 | 0 | -50 | 0 | 0 |
| 22.09.2020 01:00 - 02:00 | 0 | -50 | 0 | 0 |
| 22.09.2020 02:00 - 03:00 | 0 | -50 | 0 | 0 |
| 22.09.2020 03:00 - 04:00 | 0 | -90 | 0 | 0 |
| 22.09.2020 04:00 - 05:00 | 0 | -90 | 0 | 0 |
| 22.09.2020 05:00 - 06:00 | 0 | -90 | 0 | 0 |
| 22.09.2020 06:00 - 07:00 | 0 | 0 | 0 | 0 |
| 22.09.2020 07:00 - 08:00 | 0 | 0 | 0 | 0 |
| 22.09.2020 08:00 - 09:00 | 0 | 0 | 0 | 0 |
| 22.09.2020 09:00 - 10:00 | 0 | 0 | 0 | 0 |
| 22.09.2020 10:00 - 11:00 | 0 | 0 | 0 | 0 |
| 22.09.2020 11:00 - 12:00 | 0 | 0 | 0 | 0 |
| 22.09.2020 12:00 - 13:00 | 0 | 0 | 0 | 0 |
| 22.09.2020 13:00 - 14:00 | 0 | -20 | 0 | 0 |
| 22.09.2020 14:00 - 15:00 | 0 | -20 | 0 | 0 |
| 22.09.2020 15:00 - 16:00 | 0 | -20 | 0 | 0 |
| 22.09.2020 16:00 - 17:00 | 0 | -20 | 0 | 0 |
| 22.09.2020 17:00 - 18:00 | 0 | -20 | 0 | 0 |
| 22.09.2020 18:00 - 19:00 | 0 | -20 | 0 | 0 |
| 22.09.2020 19:00 - 20:00 | 0 | -20 | 0 | 0 |
| 22.09.2020 20:00 - 21:00 | 0 | -20 | 0 | 0 |
| 22.09.2020 21:00 - 22:00 | 0 | -20 | 0 | 0 |
| 22.09.2020 22:00 - 23:00 | 0 | -20 | 0 | 0 |
| 22.09.2020 23:00 - 24:00 | 0 | -20 | 0 | 0 |
| 23.09.2020 00:00 - 01:00 | 0 | -20 | 0 | 0 |
| 23.09.2020 01:00 - 02:00 | 0 | -20 | 0 | 0 |
| 23.09.2020 02:00 - 03:00 | 0 | -20 | 0 | 0 |
| 23.09.2020 03:00 - 04:00 | 0 | -20 | 0 | 0 |
| 23.09.2020 04:00 - 05:00 | 0 | -20 | 0 | 0 |
| 23.09.2020 05:00 - 06:00 | 0 | -20 | 0 | 0 |
| 23.09.2020 06:00 - 07:00 | 0 | 0 | 0 | 0 |
| 23.09.2020 07:00 - 08:00 | 0 | 0 | 0 | 0 |
| 23.09.2020 08:00 - 09:00 | 0 | 0 | 0 | 0 |
| 23.09.2020 09:00 - 10:00 | 0 | 0 | 0 | 0 |
| 23.09.2020 10:00 - 11:00 | 0 | 0 | 0 | 0 |
| 23.09.2020 11:00 - 12:00 | 0 | 0 | 0 | 0 |
| 23.09.2020 12:00 - 13:00 | 0 | 0 | 0 | 0 |
| 23.09.2020 13:00 - 14:00 | 0 | 0 | 0 | 0 |
| 23.09.2020 14:00 - 15:00 | 0 | -30 | 0 | 0 |
| 23.09.2020 15:00 - 16:00 | 0 | -30 | 0 | 0 |
| 23.09.2020 16:00 - 17:00 | 0 | -30 | 0 | 0 |
| 23.09.2020 17:00 - 18:00 | 0 | -30 | 0 | 0 |
| 23.09.2020 18:00 - 19:00 | 0 | -30 | 0 | 0 |
| 23.09.2020 19:00 - 20:00 | 0 | -30 | 0 | 0 |
| 23.09.2020 20:00 - 21:00 | 0 | -30 | 0 | 0 |
| 23.09.2020 21:00 - 22:00 | 0 | -30 | 0 | 0 |
| 23.09.2020 22:00 - 23:00 | 0 | -30 | 0 | 0 |
| 23.09.2020 23:00 - 24:00 | 0 | -30 | 0 | 0 |
| 24.09.2020 00:00 - 01:00 | 0 | -30 | 0 | 0 |
| 24.09.2020 01:00 - 02:00 | 0 | -30 | 0 | 0 |
| 24.09.2020 02:00 - 03:00 | 0 | -30 | 0 | 0 |
| 24.09.2020 03:00 - 04:00 | 0 | -30 | 0 | 0 |
| 24.09.2020 04:00 - 05:00 | 0 | -30 | 0 | 0 |
| 24.09.2020 05:00 - 06:00 | 0 | -30 | 0 | 0 |
| 24.09.2020 06:00 - 07:00 | 0 | 0 | 0 | 0 |
| 24.09.2020 07:00 - 08:00 | 0 | 0 | 0 | 0 |
| 24.09.2020 08:00 - 09:00 | 0 | 0 | 0 | 0 |
| 24.09.2020 09:00 - 10:00 | 0 | 0 | 0 | 0 |
| 24.09.2020 10:00 - 11:00 | 0 | 0 | 0 | 0 |
| 24.09.2020 11:00 - 12:00 | 0 | 0 | 0 | 0 |
| 24.09.2020 12:00 - 13:00 | 0 | 0 | 0 | 0 |
| 24.09.2020 13:00 - 14:00 | 0 | 0 | 0 | 0 |
| 24.09.2020 14:00 - 15:00 | 0 | 0 | 0 | 0 |
| 24.09.2020 15:00 - 16:00 | 0 | 0 | 0 | 0 |
| 24.09.2020 16:00 - 17:00 | 0 | 0 | 0 | 0 |
| 24.09.2020 17:00 - 18:00 | 0 | 0 | 0 | 0 |
| 24.09.2020 18:00 - 19:00 | 0 | 0 | 0 | 0 |
| 24.09.2020 19:00 - 20:00 | 0 | 0 | 0 | 0 |
| 24.09.2020 20:00 - 21:00 | 0 | 0 | 0 | 0 |
| 24.09.2020 21:00 - 22:00 | 0 | 0 | 0 | 0 |
| 24.09.2020 22:00 - 23:00 | 0 | 0 | 0 | 0 |
| 24.09.2020 23:00 - 24:00 | 0 | 0 | 0 | 0 |
| 25.09.2020 00:00 - 01:00 | 0 | 0 | 0 | 0 |
| 25.09.2020 01:00 - 02:00 | 0 | 0 | 0 | 0 |
| 25.09.2020 02:00 - 03:00 | 0 | 0 | 0 | 0 |
| 25.09.2020 03:00 - 04:00 | 0 | 0 | 0 | 0 |
| 25.09.2020 04:00 - 05:00 | 0 | 0 | 0 | 0 |
| 25.09.2020 05:00 - 06:00 | 0 | 0 | 0 | 0 |
| 25.09.2020 06:00 - 07:00 | 0 | 0 | 0 | 0 |
| 25.09.2020 07:00 - 08:00 | 0 | 0 | 0 | 0 |
| 25.09.2020 08:00 - 09:00 | 0 | 0 | 0 | 0 |
| 25.09.2020 09:00 - 10:00 | 0 | 0 | 0 | 0 |
| 25.09.2020 10:00 - 11:00 | 0 | 0 | 0 | 0 |
| 25.09.2020 11:00 - 12:00 | 0 | 0 | 0 | 0 |
| 25.09.2020 12:00 - 13:00 | 0 | 0 | 0 | 0 |
| 25.09.2020 13:00 - 14:00 | 0 | 0 | 0 | 0 |
| 25.09.2020 14:00 - 15:00 | 0 | 0 | 0 | 0 |
| 25.09.2020 15:00 - 16:00 | 0 | 0 | 0 | 0 |
| 25.09.2020 16:00 - 17:00 | 0 | 0 | 0 | 0 |
| 25.09.2020 17:00 - 18:00 | 0 | 0 | 0 | 0 |
| 25.09.2020 18:00 - 19:00 | 0 | 0 | 0 | 0 |
| 25.09.2020 19:00 - 20:00 | 0 | 0 | 0 | 0 |
| 25.09.2020 20:00 - 21:00 | 0 | 0 | 0 | 0 |
| 25.09.2020 21:00 - 22:00 | 0 | -80 | 0 | 0 |
| 25.09.2020 22:00 - 23:00 | 0 | -80 | 0 | 0 |
| 25.09.2020 23:00 - 24:00 | 0 | -80 | 0 | 0 |
| 26.09.2020 00:00 - 01:00 | 0 | -140 | 0 | 0 |
| 26.09.2020 01:00 - 02:00 | 0 | -140 | 0 | 0 |
| 26.09.2020 02:00 - 03:00 | 0 | -140 | 0 | 0 |
| 26.09.2020 03:00 - 04:00 | 0 | -140 | 0 | 0 |
| 26.09.2020 04:00 - 05:00 | 0 | -140 | 0 | 0 |
| 26.09.2020 05:00 - 06:00 | 0 | -140 | 0 | 0 |
| 26.09.2020 06:00 - 07:00 | 0 | 0 | 0 | 0 |
| 26.09.2020 07:00 - 08:00 | 0 | 0 | 0 | 0 |
| 26.09.2020 08:00 - 09:00 | 0 | 0 | 0 | 0 |
| 26.09.2020 09:00 - 10:00 | 0 | 0 | 0 | 0 |
| 26.09.2020 10:00 - 11:00 | 0 | 0 | 0 | 0 |
| 26.09.2020 11:00 - 12:00 | 0 | 0 | 0 | 0 |
| 26.09.2020 12:00 - 13:00 | 0 | 0 | 0 | 0 |
| 26.09.2020 13:00 - 14:00 | 0 | 0 | 0 | 0 |
| 26.09.2020 14:00 - 15:00 | 0 | 0 | 0 | 0 |
| 26.09.2020 15:00 - 16:00 | 0 | 0 | 0 | 0 |
| 26.09.2020 16:00 - 17:00 | 0 | 0 | 0 | 0 |
| 26.09.2020 17:00 - 18:00 | 0 | 0 | 0 | 0 |
| 26.09.2020 18:00 - 19:00 | 0 | 0 | 0 | 0 |
| 26.09.2020 19:00 - 20:00 | 0 | 0 | 0 | 0 |
| 26.09.2020 20:00 - 21:00 | 0 | 0 | 0 | 0 |
| 26.09.2020 21:00 - 22:00 | 0 | 0 | 0 | 0 |
| 26.09.2020 22:00 - 23:00 | 0 | 0 | 0 | 0 |
| 26.09.2020 23:00 - 24:00 | 0 | 0 | 0 | 0 |
| 27.09.2020 00:00 - 01:00 | 0 | 0 | 0 | 0 |
| 27.09.2020 01:00 - 02:00 | 0 | 0 | 0 | 0 |
| 27.09.2020 02:00 - 03:00 | 0 | 0 | 0 | 0 |
| 27.09.2020 03:00 - 04:00 | 0 | 0 | 0 | 0 |
| 27.09.2020 04:00 - 05:00 | 0 | 0 | 0 | 0 |
| 27.09.2020 05:00 - 06:00 | 0 | 0 | 0 | 0 |
| 27.09.2020 06:00 - 07:00 | 0 | 0 | 0 | 0 |
| 27.09.2020 07:00 - 08:00 | 0 | 0 | 0 | 0 |
| 27.09.2020 08:00 - 09:00 | 0 | 0 | 0 | 0 |
| 27.09.2020 09:00 - 10:00 | 0 | 0 | 0 | 0 |
| 27.09.2020 10:00 - 11:00 | 0 | 0 | 0 | 0 |
| 27.09.2020 11:00 - 12:00 | 0 | 0 | 0 | 0 |
| 27.09.2020 12:00 - 13:00 | 0 | 0 | 0 | 0 |
| 27.09.2020 13:00 - 14:00 | 0 | 0 | 0 | 0 |
| 27.09.2020 14:00 - 15:00 | 0 | 0 | 0 | 0 |
| 27.09.2020 15:00 - 16:00 | 0 | 0 | 0 | 0 |
| 27.09.2020 16:00 - 17:00 | 0 | 0 | 0 | 0 |
| 27.09.2020 17:00 - 18:00 | 0 | 0 | 0 | 0 |
| 27.09.2020 18:00 - 19:00 | 0 | 0 | 0 | 0 |
| 27.09.2020 19:00 - 20:00 | 0 | 0 | 0 | 0 |
| 27.09.2020 20:00 - 21:00 | 0 | -80 | 0 | 0 |
| 27.09.2020 21:00 - 22:00 | 0 | -130 | 0 | 0 |
| 27.09.2020 22:00 - 23:00 | 0 | -130 | 0 | 0 |
| 27.09.2020 23:00 - 24:00 | 0 | -130 | 0 | 0 |
| 28.09.2020 00:00 - 01:00 | 0 | -130 | 0 | 0 |
| 28.09.2020 01:00 - 02:00 | 0 | -130 | 0 | 0 |
| 28.09.2020 02:00 - 03:00 | 0 | -130 | 0 | 0 |
| 28.09.2020 03:00 - 04:00 | 0 | -130 | 0 | 0 |
| 28.09.2020 04:00 - 05:00 | 0 | -130 | 0 | 0 |
| 28.09.2020 05:00 - 06:00 | 0 | -130 | 0 | 0 |
| 28.09.2020 06:00 - 07:00 | 0 | 0 | 0 | 0 |
| 28.09.2020 07:00 - 08:00 | 0 | 0 | 0 | 0 |
| 28.09.2020 08:00 - 09:00 | 0 | 0 | 0 | 0 |
| 28.09.2020 09:00 - 10:00 | 0 | 0 | 0 | 0 |
| 28.09.2020 10:00 - 11:00 | 0 | 0 | 0 | 0 |
| 28.09.2020 11:00 - 12:00 | 0 | 0 | 0 | 0 |
| 28.09.2020 12:00 - 13:00 | 0 | 0 | 0 | 0 |
| 28.09.2020 13:00 - 14:00 | 0 | 0 | 0 | 0 |
| 28.09.2020 14:00 - 15:00 | 0 | 0 | 0 | 0 |
| 28.09.2020 15:00 - 16:00 | 0 | 0 | 0 | 0 |
| 28.09.2020 16:00 - 17:00 | 0 | 0 | 0 | 0 |
| 28.09.2020 17:00 - 18:00 | 0 | 0 | 0 | 0 |
| 28.09.2020 18:00 - 19:00 | 0 | 0 | 0 | 0 |
| 28.09.2020 19:00 - 20:00 | 0 | 0 | 0 | 0 |
| 28.09.2020 20:00 - 21:00 | 0 | 0 | 0 | 0 |
| 28.09.2020 21:00 - 22:00 | 0 | 0 | 0 | 0 |
| 28.09.2020 22:00 - 23:00 | 0 | 0 | 0 | 0 |
| 28.09.2020 23:00 - 24:00 | 0 | 0 | 0 | 0 |
| 29.09.2020 00:00 - 01:00 | 0 | 0 | 0 | 0 |
| 29.09.2020 01:00 - 02:00 | 0 | 0 | 0 | 0 |
| 29.09.2020 02:00 - 03:00 | 0 | 0 | 0 | 0 |
| 29.09.2020 03:00 - 04:00 | 0 | 0 | 0 | 0 |
| 29.09.2020 04:00 - 05:00 | 0 | 0 | 0 | 0 |
| 29.09.2020 05:00 - 06:00 | 0 | 0 | 0 | 0 |
| 29.09.2020 06:00 - 07:00 | 0 | 0 | 0 | 0 |
| 29.09.2020 07:00 - 08:00 | 0 | 0 | 0 | 0 |
| 29.09.2020 08:00 - 09:00 | 0 | 0 | 0 | 0 |
| 29.09.2020 09:00 - 10:00 | 0 | 0 | 0 | 0 |
| 29.09.2020 10:00 - 11:00 | 0 | 0 | 0 | 0 |
| 29.09.2020 11:00 - 12:00 | 0 | 0 | 0 | 0 |
| 29.09.2020 12:00 - 13:00 | 0 | 0 | 0 | 0 |
| 29.09.2020 13:00 - 14:00 | 0 | 0 | 0 | 0 |
| 29.09.2020 14:00 - 15:00 | 0 | 0 | 0 | 0 |
| 29.09.2020 15:00 - 16:00 | 0 | 0 | 0 | 0 |
| 29.09.2020 16:00 - 17:00 | 20 | 0 | 0 | 0 |
| 29.09.2020 17:00 - 18:00 | 20 | 0 | 0 | 0 |
| 29.09.2020 18:00 - 19:00 | 20 | 0 | 0 | 0 |
| 29.09.2020 19:00 - 20:00 | 20 | 0 | 0 | 0 |
| 29.09.2020 20:00 - 21:00 | 20 | 0 | 0 | 0 |
| 29.09.2020 21:00 - 22:00 | 20 | 0 | 0 | 0 |
| 29.09.2020 22:00 - 23:00 | 20 | 0 | 0 | 0 |
| 29.09.2020 23:00 - 24:00 | 20 | -30 | 0 | 0 |
| 30.09.2020 00:00 - 01:00 | 20 | -30 | 0 | 0 |
| 30.09.2020 01:00 - 02:00 | 20 | -30 | 0 | 0 |
| 30.09.2020 02:00 - 03:00 | 20 | -30 | 0 | 0 |
| 30.09.2020 03:00 - 04:00 | 20 | -30 | 0 | 0 |
| 30.09.2020 04:00 - 05:00 | 20 | -30 | 0 | 0 |
| 30.09.2020 05:00 - 06:00 | 20 | -30 | 0 | 0 |
| 30.09.2020 06:00 - 07:00 | 0 | 0 | 0 | 0 |
| 30.09.2020 07:00 - 08:00 | 0 | 0 | 0 | 0 |
| 30.09.2020 08:00 - 09:00 | 0 | 0 | 0 | 0 |
| 30.09.2020 09:00 - 10:00 | 0 | 0 | 0 | 0 |
| 30.09.2020 10:00 - 11:00 | 0 | 0 | 0 | 0 |
| 30.09.2020 11:00 - 12:00 | 0 | 0 | 0 | 0 |